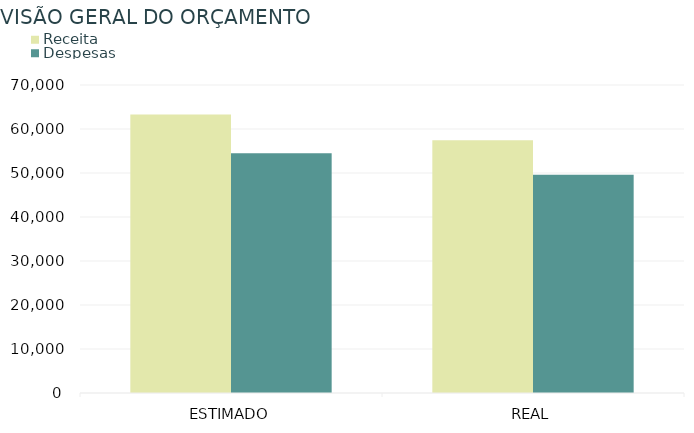
| Category | Receita | Despesas |
|---|---|---|
| ESTIMADO | 63300 | 54500 |
| REAL | 57450 | 49630 |